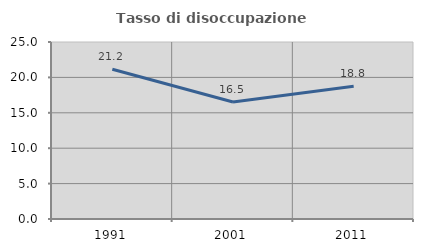
| Category | Tasso di disoccupazione giovanile  |
|---|---|
| 1991.0 | 21.159 |
| 2001.0 | 16.529 |
| 2011.0 | 18.75 |